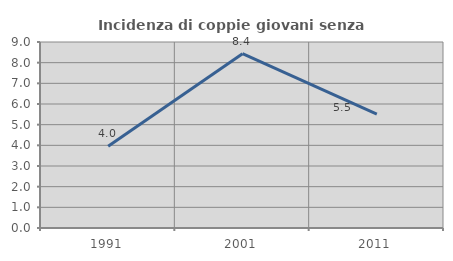
| Category | Incidenza di coppie giovani senza figli |
|---|---|
| 1991.0 | 3.958 |
| 2001.0 | 8.435 |
| 2011.0 | 5.504 |